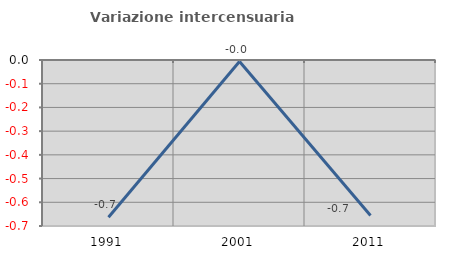
| Category | Variazione intercensuaria annua |
|---|---|
| 1991.0 | -0.663 |
| 2001.0 | -0.007 |
| 2011.0 | -0.656 |